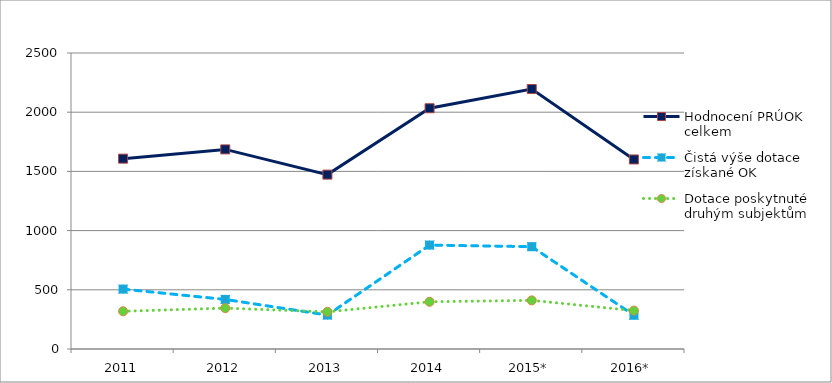
| Category | Hodnocení PRÚOK celkem | Čistá výše dotace získané OK | Dotace poskytnuté druhým subjektům |
|---|---|---|---|
| 2011 | 1607638 | 505857 | 318555 |
| 2012 | 1685842 | 418589 | 345101 |
| 2013 | 1472887 | 286508 | 313709 |
| 2014 | 2033395 | 877745 | 398848 |
| 2015* | 2195630 | 864091 | 410739 |
| 2016* | 1600863 | 285014 | 324541 |